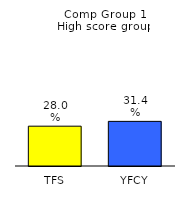
| Category | Series 0 |
|---|---|
| TFS | 0.28 |
| YFCY | 0.314 |